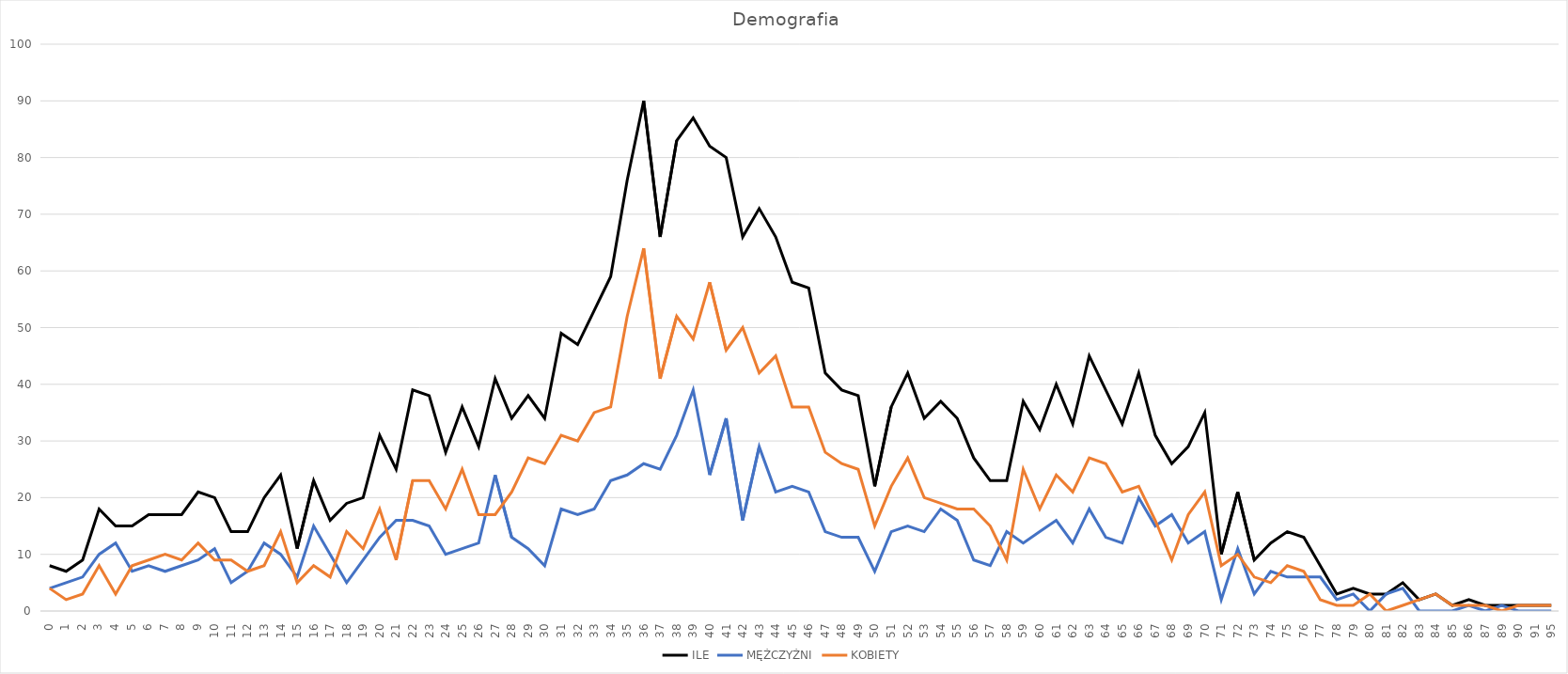
| Category | ILE | MĘŻCZYŻNI | KOBIETY |
|---|---|---|---|
| 0.0 | 8 | 4 | 4 |
| 1.0 | 7 | 5 | 2 |
| 2.0 | 9 | 6 | 3 |
| 3.0 | 18 | 10 | 8 |
| 4.0 | 15 | 12 | 3 |
| 5.0 | 15 | 7 | 8 |
| 6.0 | 17 | 8 | 9 |
| 7.0 | 17 | 7 | 10 |
| 8.0 | 17 | 8 | 9 |
| 9.0 | 21 | 9 | 12 |
| 10.0 | 20 | 11 | 9 |
| 11.0 | 14 | 5 | 9 |
| 12.0 | 14 | 7 | 7 |
| 13.0 | 20 | 12 | 8 |
| 14.0 | 24 | 10 | 14 |
| 15.0 | 11 | 6 | 5 |
| 16.0 | 23 | 15 | 8 |
| 17.0 | 16 | 10 | 6 |
| 18.0 | 19 | 5 | 14 |
| 19.0 | 20 | 9 | 11 |
| 20.0 | 31 | 13 | 18 |
| 21.0 | 25 | 16 | 9 |
| 22.0 | 39 | 16 | 23 |
| 23.0 | 38 | 15 | 23 |
| 24.0 | 28 | 10 | 18 |
| 25.0 | 36 | 11 | 25 |
| 26.0 | 29 | 12 | 17 |
| 27.0 | 41 | 24 | 17 |
| 28.0 | 34 | 13 | 21 |
| 29.0 | 38 | 11 | 27 |
| 30.0 | 34 | 8 | 26 |
| 31.0 | 49 | 18 | 31 |
| 32.0 | 47 | 17 | 30 |
| 33.0 | 53 | 18 | 35 |
| 34.0 | 59 | 23 | 36 |
| 35.0 | 76 | 24 | 52 |
| 36.0 | 90 | 26 | 64 |
| 37.0 | 66 | 25 | 41 |
| 38.0 | 83 | 31 | 52 |
| 39.0 | 87 | 39 | 48 |
| 40.0 | 82 | 24 | 58 |
| 41.0 | 80 | 34 | 46 |
| 42.0 | 66 | 16 | 50 |
| 43.0 | 71 | 29 | 42 |
| 44.0 | 66 | 21 | 45 |
| 45.0 | 58 | 22 | 36 |
| 46.0 | 57 | 21 | 36 |
| 47.0 | 42 | 14 | 28 |
| 48.0 | 39 | 13 | 26 |
| 49.0 | 38 | 13 | 25 |
| 50.0 | 22 | 7 | 15 |
| 51.0 | 36 | 14 | 22 |
| 52.0 | 42 | 15 | 27 |
| 53.0 | 34 | 14 | 20 |
| 54.0 | 37 | 18 | 19 |
| 55.0 | 34 | 16 | 18 |
| 56.0 | 27 | 9 | 18 |
| 57.0 | 23 | 8 | 15 |
| 58.0 | 23 | 14 | 9 |
| 59.0 | 37 | 12 | 25 |
| 60.0 | 32 | 14 | 18 |
| 61.0 | 40 | 16 | 24 |
| 62.0 | 33 | 12 | 21 |
| 63.0 | 45 | 18 | 27 |
| 64.0 | 39 | 13 | 26 |
| 65.0 | 33 | 12 | 21 |
| 66.0 | 42 | 20 | 22 |
| 67.0 | 31 | 15 | 16 |
| 68.0 | 26 | 17 | 9 |
| 69.0 | 29 | 12 | 17 |
| 70.0 | 35 | 14 | 21 |
| 71.0 | 10 | 2 | 8 |
| 72.0 | 21 | 11 | 10 |
| 73.0 | 9 | 3 | 6 |
| 74.0 | 12 | 7 | 5 |
| 75.0 | 14 | 6 | 8 |
| 76.0 | 13 | 6 | 7 |
| 77.0 | 8 | 6 | 2 |
| 78.0 | 3 | 2 | 1 |
| 79.0 | 4 | 3 | 1 |
| 80.0 | 3 | 0 | 3 |
| 81.0 | 3 | 3 | 0 |
| 82.0 | 5 | 4 | 1 |
| 83.0 | 2 | 0 | 2 |
| 84.0 | 3 | 0 | 3 |
| 85.0 | 1 | 0 | 1 |
| 86.0 | 2 | 1 | 1 |
| 87.0 | 1 | 0 | 1 |
| 89.0 | 1 | 1 | 0 |
| 90.0 | 1 | 0 | 1 |
| 91.0 | 1 | 0 | 1 |
| 95.0 | 1 | 0 | 1 |